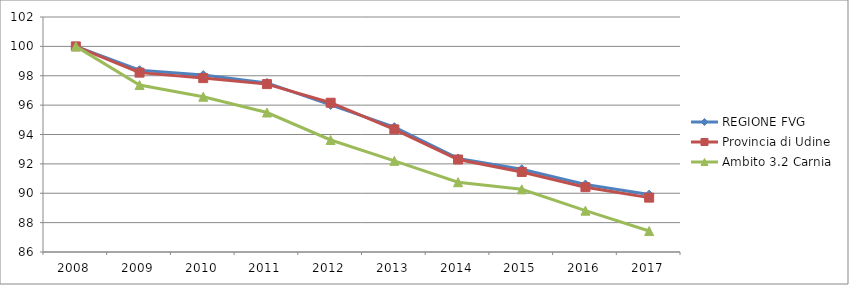
| Category | REGIONE FVG | Provincia di Udine | Ambito 3.2 Carnia |
|---|---|---|---|
| 2008.0 | 100 | 100 | 100 |
| 2009.0 | 98.378 | 98.213 | 97.368 |
| 2010.0 | 98.049 | 97.839 | 96.571 |
| 2011.0 | 97.515 | 97.431 | 95.497 |
| 2012.0 | 96.012 | 96.162 | 93.627 |
| 2013.0 | 94.5 | 94.348 | 92.206 |
| 2014.0 | 92.37 | 92.296 | 90.752 |
| 2015.0 | 91.632 | 91.451 | 90.267 |
| 2016.0 | 90.595 | 90.414 | 88.812 |
| 2017.0 | 89.908 | 89.702 | 87.426 |